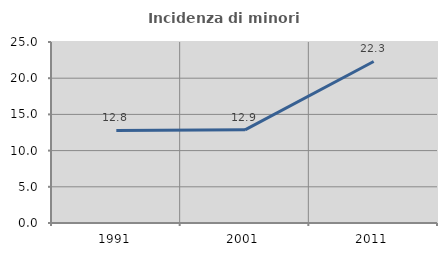
| Category | Incidenza di minori stranieri |
|---|---|
| 1991.0 | 12.791 |
| 2001.0 | 12.865 |
| 2011.0 | 22.31 |